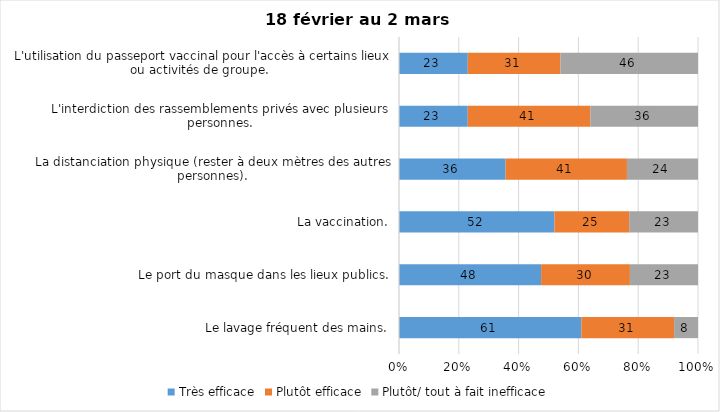
| Category | Très efficace | Plutôt efficace | Plutôt/ tout à fait inefficace |
|---|---|---|---|
| Le lavage fréquent des mains. | 61 | 31 | 8 |
| Le port du masque dans les lieux publics. | 48 | 30 | 23 |
| La vaccination. | 52 | 25 | 23 |
| La distanciation physique (rester à deux mètres des autres personnes). | 36 | 41 | 24 |
| L'interdiction des rassemblements privés avec plusieurs personnes. | 23 | 41 | 36 |
| L'utilisation du passeport vaccinal pour l'accès à certains lieux ou activités de groupe.  | 23 | 31 | 46 |